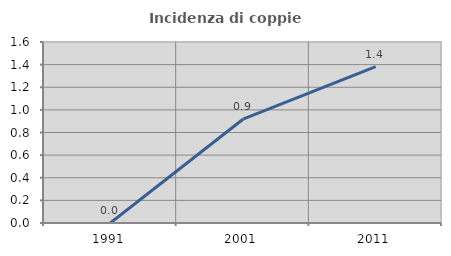
| Category | Incidenza di coppie miste |
|---|---|
| 1991.0 | 0 |
| 2001.0 | 0.917 |
| 2011.0 | 1.382 |